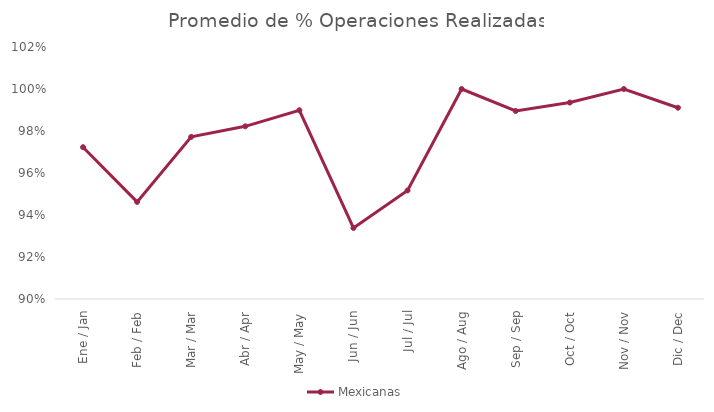
| Category | Mexicanas |
|---|---|
| Ene / Jan | 0.972 |
| Feb / Feb | 0.946 |
| Mar / Mar | 0.977 |
| Abr / Apr | 0.982 |
| May / May | 0.99 |
| Jun / Jun | 0.934 |
| Jul / Jul | 0.952 |
| Ago / Aug | 1 |
| Sep / Sep | 0.99 |
| Oct / Oct | 0.994 |
| Nov / Nov | 1 |
| Dic / Dec | 0.991 |